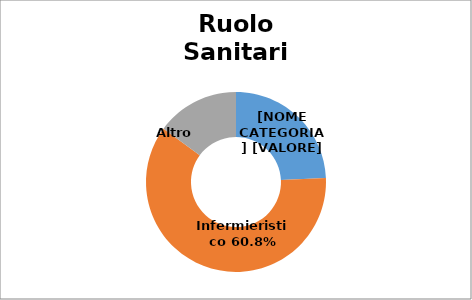
| Category | Series 0 |
|---|---|
| Medici e Odontoiatri | 0.243 |
| Infermieristico | 0.608 |
| Altro  | 0.149 |